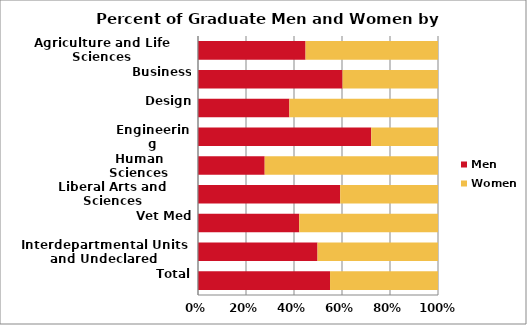
| Category | Men | Women |
|---|---|---|
| Agriculture and Life Sciences | 242 | 298 |
| Business | 265 | 175 |
| Design | 67 | 109 |
| Engineering | 781 | 301 |
| Human Sciences | 137 | 356 |
| Liberal Arts and Sciences | 628 | 432 |
| Vet Med | 70 | 96 |
| Interdepartmental Units and Undeclared | 126 | 127 |
| Total | 2316 | 1894 |